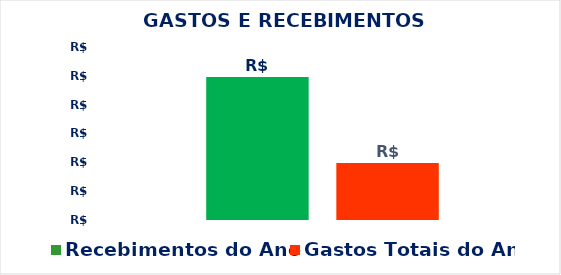
| Category | Recebimentos do Ano  | Gastos Totais do Ano |
|---|---|---|
| 0 | 7500 | 7440 |